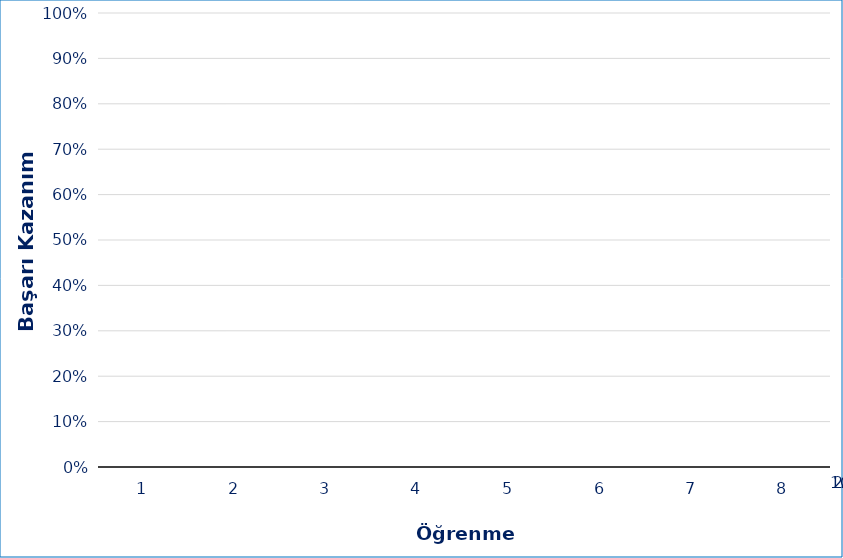
| Category | GS | 2.AS | 1. AS |
|---|---|---|---|
| 0 | 0 | 0 | 0 |
| 1 | 0 | 0 | 0 |
| 2 | 0 | 0 | 0 |
| 3 | 0 | 0 | 0 |
| 4 | 0 | 0 | 0 |
| 5 | 0 | 0 | 0 |
| 6 | 0 | 0 | 0 |
| 7 | 0 | 0 | 0 |